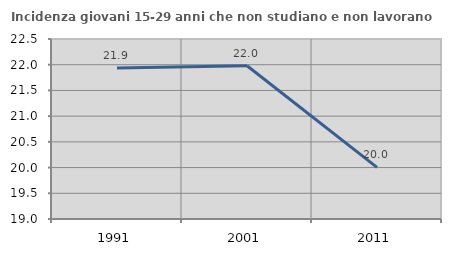
| Category | Incidenza giovani 15-29 anni che non studiano e non lavorano  |
|---|---|
| 1991.0 | 21.934 |
| 2001.0 | 21.979 |
| 2011.0 | 20.005 |